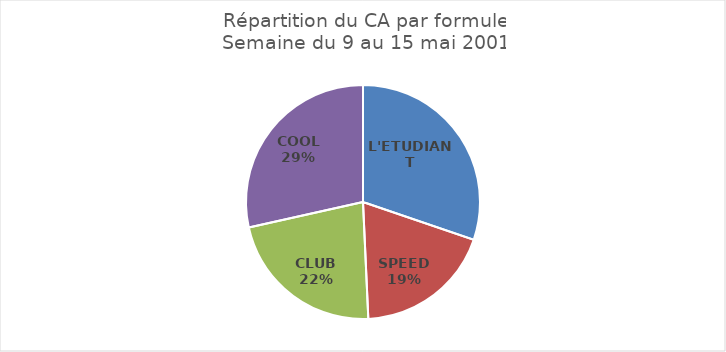
| Category | Series 0 |
|---|---|
| L'ETUDIANT | 208 |
| SPEED | 131 |
| CLUB | 153 |
| COOL | 196 |